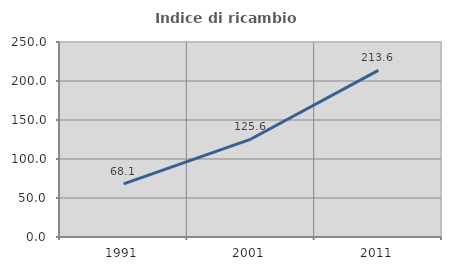
| Category | Indice di ricambio occupazionale  |
|---|---|
| 1991.0 | 68.142 |
| 2001.0 | 125.581 |
| 2011.0 | 213.636 |